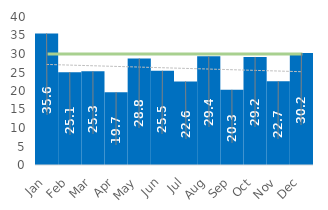
| Category | Days Sales outstanding |
|---|---|
| Jan | 35.562 |
| Feb | 25.091 |
| Mar | 25.317 |
| Apr | 19.695 |
| May | 28.809 |
| Jun | 25.479 |
| Jul | 22.588 |
| Aug | 29.39 |
| Sep | 20.329 |
| Oct | 29.213 |
| Nov | 22.662 |
| Dec | 30.249 |